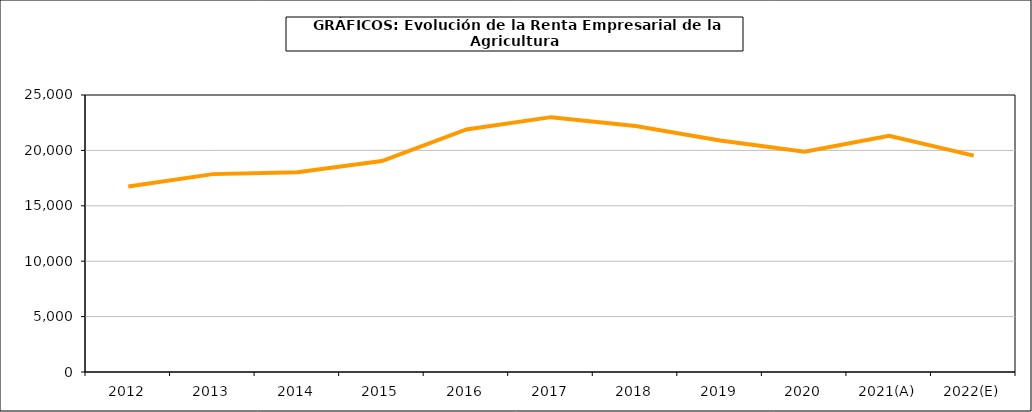
| Category | renta empresarial |
|---|---|
| 2012 | 16739.148 |
| 2013 | 17858.951 |
| 2014 | 18029.917 |
| 2015 | 19041.49 |
| 2016 | 21888.067 |
| 2017 | 23001.377 |
| 2018 | 22207.785 |
| 2019 | 20890.665 |
| 2020 | 19887.467 |
| 2021(A) | 21313.542 |
| 2022(E) | 19528.945 |